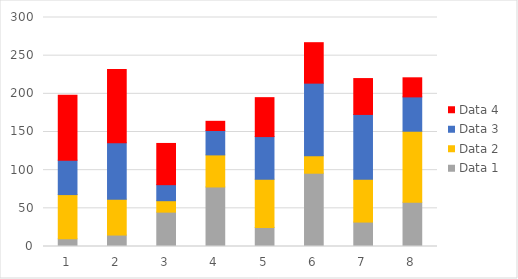
| Category | Data 3 | Data 4 | Data 1 | Data 2 |
|---|---|---|---|---|
| 0 | 45 | 85 | 10 | 58 |
| 1 | 74 | 96 | 15 | 47 |
| 2 | 21 | 54 | 45 | 15 |
| 3 | 32 | 12 | 78 | 42 |
| 4 | 56 | 51 | 25 | 63 |
| 5 | 95 | 53 | 96 | 23 |
| 6 | 85 | 47 | 32 | 56 |
| 7 | 45 | 25 | 58 | 93 |